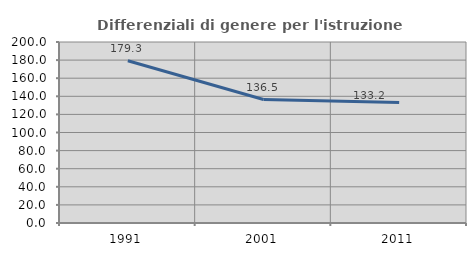
| Category | Differenziali di genere per l'istruzione superiore |
|---|---|
| 1991.0 | 179.332 |
| 2001.0 | 136.45 |
| 2011.0 | 133.179 |